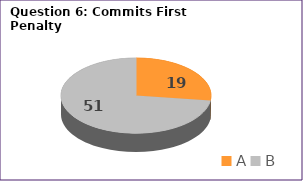
| Category | Series 0 |
|---|---|
| A | 19 |
| B | 51 |